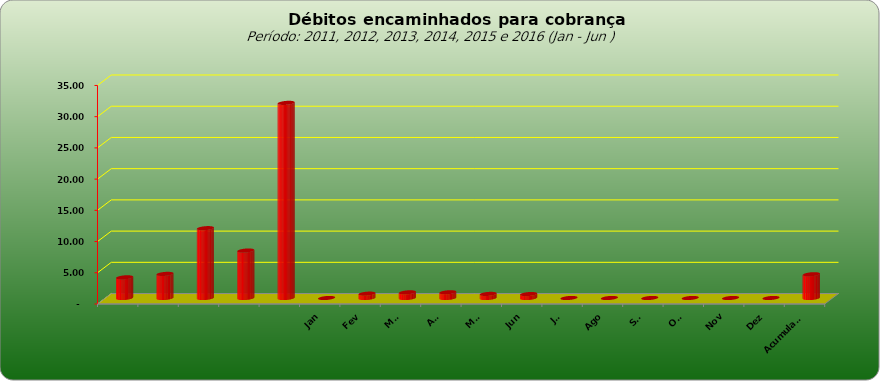
| Category |  3.309.443,02  |
|---|---|
|  | 3309443.02 |
|  | 3859728.44 |
|  | 11181928.25 |
|  | 7600526.01 |
|  | 31248623.5 |
| Jan | 0 |
| Fev | 695716.82 |
| Mar | 906394.22 |
| Abr | 915013.51 |
| Mai | 654375.79 |
| Jun | 631930.49 |
| Jul | 0 |
| Ago | 0 |
| Set | 0 |
| Out | 0 |
| Nov | 0 |
| Dez | 0 |
| Acumulado | 3803430.83 |